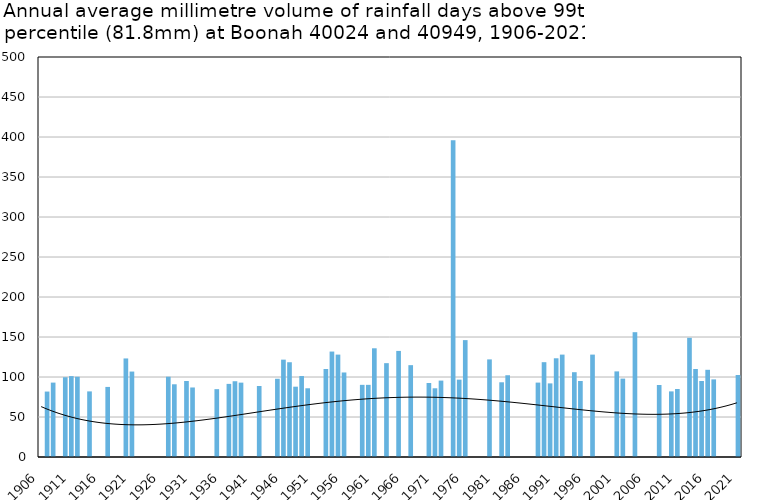
| Category | Annual average mm in days above 99th percentile |
|---|---|
| 1906 | 0 |
| 1907 | 81.8 |
| 1908 | 93 |
| 1909 | 0 |
| 1910 | 99.7 |
| 1911 | 101.1 |
| 1912 | 100.3 |
| 1913 | 0 |
| 1914 | 82 |
| 1915 | 0 |
| 1916 | 0 |
| 1917 | 87.6 |
| 1918 | 0 |
| 1919 | 0 |
| 1920 | 123.2 |
| 1921 | 106.8 |
| 1922 | 0 |
| 1923 | 0 |
| 1924 | 0 |
| 1925 | 0 |
| 1926 | 0 |
| 1927 | 100.35 |
| 1928 | 90.9 |
| 1929 | 0 |
| 1930 | 95 |
| 1931 | 86.9 |
| 1932 | 0 |
| 1933 | 0 |
| 1934 | 0 |
| 1935 | 84.8 |
| 1936 | 0 |
| 1937 | 91.4 |
| 1938 | 94.7 |
| 1939 | 92.95 |
| 1940 | 0 |
| 1941 | 0 |
| 1942 | 88.75 |
| 1943 | 0 |
| 1944 | 0 |
| 1945 | 97.8 |
| 1946 | 121.7 |
| 1947 | 118.45 |
| 1948 | 87.9 |
| 1949 | 101.2 |
| 1950 | 85.9 |
| 1951 | 0 |
| 1952 | 0 |
| 1953 | 110 |
| 1954 | 131.8 |
| 1955 | 128 |
| 1956 | 105.65 |
| 1957 | 0 |
| 1958 | 0 |
| 1959 | 90.2 |
| 1960 | 90.2 |
| 1961 | 135.9 |
| 1962 | 0 |
| 1963 | 117.3 |
| 1964 | 0 |
| 1965 | 132.6 |
| 1966 | 0 |
| 1967 | 114.8 |
| 1968 | 0 |
| 1969 | 0 |
| 1970 | 92.5 |
| 1971 | 85.9 |
| 1972 | 95.5 |
| 1973 | 0 |
| 1974 | 396 |
| 1975 | 96.7 |
| 1976 | 146.1 |
| 1977 | 0 |
| 1978 | 0 |
| 1979 | 0 |
| 1980 | 122 |
| 1981 | 0 |
| 1982 | 93.4 |
| 1983 | 102.2 |
| 1984 | 0 |
| 1985 | 0 |
| 1986 | 0 |
| 1987 | 0 |
| 1988 | 93 |
| 1989 | 118.533 |
| 1990 | 92 |
| 1991 | 123.4 |
| 1992 | 128 |
| 1993 | 0 |
| 1994 | 106 |
| 1995 | 95 |
| 1996 | 0 |
| 1997 | 128 |
| 1998 | 0 |
| 1999 | 0 |
| 2000 | 0 |
| 2001 | 107 |
| 2002 | 98 |
| 2003 | 0 |
| 2004 | 156 |
| 2005 | 0 |
| 2006 | 0 |
| 2007 | 0 |
| 2008 | 90 |
| 2009 | 0 |
| 2010 | 82 |
| 2011 | 85 |
| 2012 | 0 |
| 2013 | 149 |
| 2014 | 110 |
| 2015 | 95 |
| 2016 | 109 |
| 2017 | 97 |
| 2018 | 0 |
| 2019 | 0 |
| 2020 | 0 |
| 2021 | 102.5 |